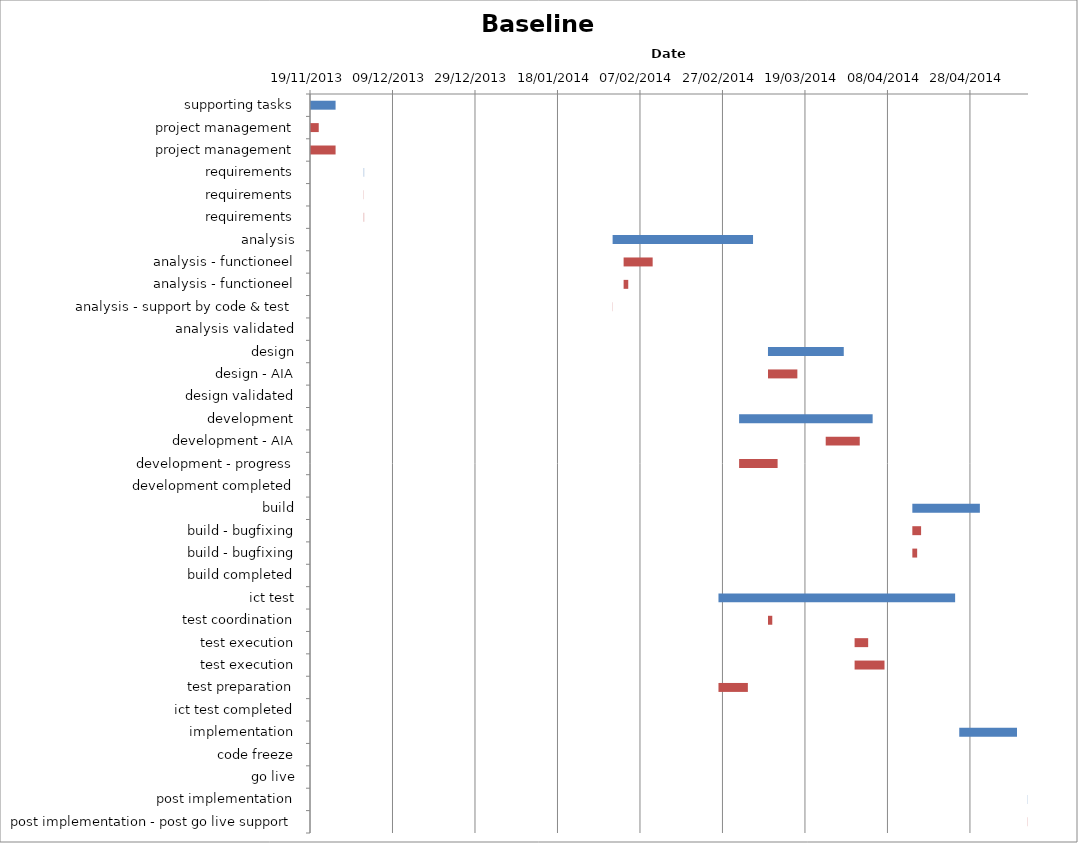
| Category | Baseline start | Actual duration |
|---|---|---|
| supporting tasks | 41597.333 | 6.167 |
| project management | 41597.333 | 2.083 |
| project management | 41597.333 | 6.167 |
| requirements | 41610.333 | 0.083 |
| requirements | 41610.333 | 0.042 |
| requirements | 41610.333 | 0.083 |
| analysis | 41670.667 | 34.042 |
| analysis - functioneel | 41673.333 | 7.042 |
| analysis - functioneel | 41673.333 | 1.125 |
| analysis - support by code & test | 41670.667 | 0.042 |
| analysis validated | 41704.708 | 0 |
| design | 41708.333 | 18.375 |
| design - AIA | 41708.333 | 7.125 |
| design validated | 41726.708 | 0 |
| development | 41701.333 | 32.375 |
| development - AIA | 41722.333 | 8.25 |
| development - progress | 41701.333 | 9.333 |
| development completed | 41733.708 | 0 |
| build | 41743.333 | 16.375 |
| build - bugfixing | 41743.333 | 2.125 |
| build - bugfixing | 41743.333 | 1.167 |
| build completed | 41759.708 | 0 |
| ict test | 41696.333 | 57.375 |
| test coordination | 41708.333 | 1.042 |
| test execution | 41729.333 | 3.292 |
| test execution | 41729.333 | 7.25 |
| test preparation | 41696.333 | 7.125 |
| ict test completed | 41753.708 | 0 |
| implementation | 41754.708 | 14 |
| code freeze | 41754.708 | 0 |
| go live | 41768.708 | 0 |
| post implementation | 41771.333 | 0.042 |
| post implementation - post go live support | 41771.333 | 0.042 |